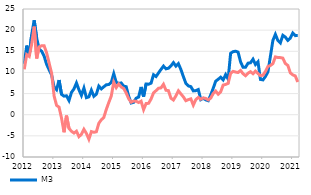
| Category | M3  | Domestic loans to the non-monetary sector |
|---|---|---|
| 2012-01-01 | 12.01 | 10.729 |
| 2012-02-01 | 16.354 | 14.221 |
| 2012-03-01 | 13.992 | 13.782 |
| 2012-04-01 | 18.952 | 16.69 |
| 2012-05-01 | 22.329 | 20.823 |
| 2012-06-01 | 18.134 | 13.296 |
| 2012-07-01 | 15.507 | 16.043 |
| 2012-08-01 | 15.015 | 16.313 |
| 2012-09-01 | 13.837 | 16.292 |
| 2012-10-01 | 11.912 | 14.641 |
| 2012-11-01 | 10.629 | 12.241 |
| 2012-12-01 | 9.421 | 9.834 |
| 2013-01-01 | 6.554 | 4.448 |
| 2013-02-01 | 5.916 | 2.211 |
| 2013-03-01 | 8.196 | 1.791 |
| 2013-04-01 | 4.809 | -0.816 |
| 2013-05-01 | 4.39 | -4.149 |
| 2013-06-01 | 4.482 | -0.203 |
| 2013-07-01 | 3.358 | -3.232 |
| 2013-08-01 | 5.277 | -3.913 |
| 2013-09-01 | 6.108 | -4.338 |
| 2013-10-01 | 7.502 | -3.897 |
| 2013-11-01 | 5.896 | -5.181 |
| 2013-12-01 | 4.573 | -4.65 |
| 2014-01-01 | 6.313 | -3.453 |
| 2014-02-01 | 4.038 | -4.43 |
| 2014-03-01 | 4.234 | -5.804 |
| 2014-04-01 | 5.797 | -3.993 |
| 2014-05-01 | 4.358 | -4.149 |
| 2014-06-01 | 4.845 | -4.035 |
| 2014-07-01 | 6.767 | -2.016 |
| 2014-08-01 | 6.108 | -1.198 |
| 2014-09-01 | 6.605 | -0.64 |
| 2014-10-01 | 7.075 | 1.254 |
| 2014-11-01 | 7.143 | 2.875 |
| 2014-12-01 | 7.648 | 4.423 |
| 2015-01-01 | 9.694 | 7.684 |
| 2015-02-01 | 7.639 | 6.418 |
| 2015-03-01 | 7.404 | 7.278 |
| 2015-04-01 | 7.508 | 6.557 |
| 2015-05-01 | 6.749 | 6.196 |
| 2015-06-01 | 6.629 | 5.14 |
| 2015-07-01 | 4.381 | 3.777 |
| 2015-08-01 | 2.769 | 2.956 |
| 2015-09-01 | 2.936 | 3.226 |
| 2015-10-01 | 3.902 | 3.199 |
| 2015-11-01 | 4.175 | 2.893 |
| 2015-12-01 | 6.564 | 3.196 |
| 2016-01-01 | 4.278 | 1.199 |
| 2016-02-01 | 7.267 | 2.638 |
| 2016-03-01 | 7.218 | 2.687 |
| 2016-04-01 | 7.458 | 3.711 |
| 2016-05-01 | 9.45 | 5.171 |
| 2016-06-01 | 9.03 | 5.69 |
| 2016-07-01 | 9.881 | 6.257 |
| 2016-08-01 | 10.715 | 6.355 |
| 2016-09-01 | 11.496 | 7.196 |
| 2016-10-01 | 10.853 | 5.785 |
| 2016-11-01 | 11.002 | 5.691 |
| 2016-12-01 | 11.553 | 3.906 |
| 2017-01-01 | 12.319 | 3.475 |
| 2017-02-01 | 11.489 | 4.47 |
| 2017-03-01 | 12.067 | 5.654 |
| 2017-04-01 | 10.696 | 4.923 |
| 2017-05-01 | 9.013 | 4.221 |
| 2017-06-01 | 7.423 | 3.312 |
| 2017-07-01 | 6.807 | 3.565 |
| 2017-08-01 | 6.642 | 3.755 |
| 2017-09-01 | 5.632 | 2.278 |
| 2017-10-01 | 5.691 | 3.574 |
| 2017-11-01 | 5.952 | 4.092 |
| 2017-12-01 | 3.567 | 3.671 |
| 2018-01-01 | 3.888 | 3.977 |
| 2018-02-01 | 3.511 | 3.859 |
| 2018-03-01 | 3.318 | 3.502 |
| 2018-04-01 | 4.689 | 3.934 |
| 2018-05-01 | 6.249 | 5.016 |
| 2018-06-01 | 7.929 | 5.586 |
| 2018-07-01 | 8.383 | 4.847 |
| 2018-08-01 | 8.861 | 5.412 |
| 2018-09-01 | 8.24 | 7.016 |
| 2018-10-31 | 9.483 | 7.163 |
| 2018-11-30 | 8.409 | 7.417 |
| 2018-12-31 | 14.522 | 9.795 |
| 2019-01-31 | 14.909 | 10.252 |
| 2019-02-28 | 15.018 | 10.086 |
| 2019-03-31 | 14.797 | 9.982 |
| 2019-04-30 | 12.506 | 10.464 |
| 2019-05-31 | 11.216 | 9.694 |
| 2019-06-30 | 11.23 | 9.224 |
| 2019-07-31 | 12.186 | 9.826 |
| 2019-08-31 | 12.279 | 10.177 |
| 2019-09-30 | 13.127 | 9.697 |
| 2019-10-31 | 11.864 | 10.311 |
| 2019-11-30 | 12.513 | 9.755 |
| 2019-12-31 | 8.354 | 9.245 |
| 2020-01-31 | 8.237 | 9.334 |
| 2020-02-29 | 9.035 | 10.229 |
| 2020-03-31 | 10.113 | 11.424 |
| 2020-04-30 | 13.811 | 11.641 |
| 2020-05-31 | 17.557 | 12.071 |
| 2020-06-30 | 18.995 | 13.679 |
| 2020-07-31 | 17.552 | 13.526 |
| 2020-08-31 | 16.965 | 13.505 |
| 2020-09-30 | 18.779 | 13.379 |
| 2020-10-31 | 18.356 | 12.108 |
| 2020-11-30 | 17.578 | 11.663 |
| 2020-12-31 | 18.105 | 9.901 |
| 2021-01-31 | 19.323 | 9.428 |
| 2021-02-28 | 18.702 | 9.17 |
| 2021-03-31 | 18.724 | 7.735 |